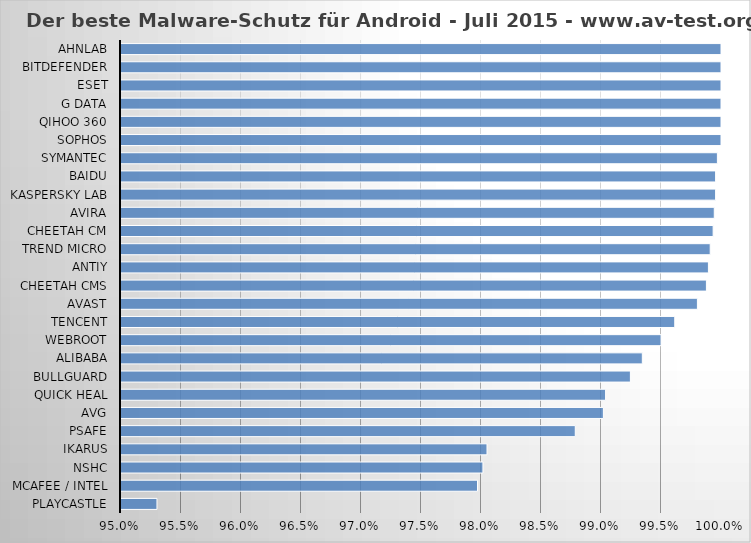
| Category | Series 0 |
|---|---|
| Playcastle | 0.953 |
| McAfee / Intel | 0.98 |
| NSHC | 0.98 |
| Ikarus | 0.981 |
| PSafe | 0.988 |
| AVG | 0.99 |
| Quick Heal | 0.99 |
| BullGuard | 0.992 |
| Alibaba | 0.993 |
| Webroot | 0.995 |
| Tencent | 0.996 |
| Avast | 0.998 |
| Cheetah CMS | 0.999 |
| Antiy | 0.999 |
| Trend Micro | 0.999 |
| Cheetah CM | 0.999 |
| Avira | 0.999 |
| Kaspersky Lab | 1 |
| Baidu | 1 |
| Symantec | 1 |
| Sophos | 1 |
| Qihoo 360 | 1 |
| G Data | 1 |
| ESET | 1 |
| Bitdefender | 1 |
| AhnLab | 1 |